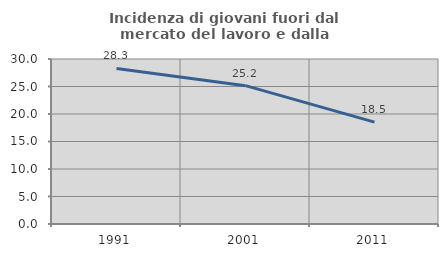
| Category | Incidenza di giovani fuori dal mercato del lavoro e dalla formazione  |
|---|---|
| 1991.0 | 28.289 |
| 2001.0 | 25.152 |
| 2011.0 | 18.519 |